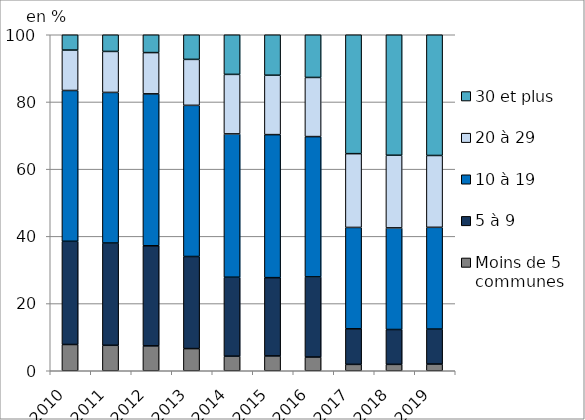
| Category | Moins de 5 communes | 5 à 9 | 10 à 19 | 20 à 29 | 30 et plus |
|---|---|---|---|---|---|
| 2010.0 | 7.813 | 30.716 | 44.887 | 12.026 | 4.558 |
| 2011.0 | 7.58 | 30.435 | 44.825 | 12.197 | 4.963 |
| 2012.0 | 7.4 | 29.795 | 45.215 | 12.282 | 5.308 |
| 2013.0 | 6.596 | 27.402 | 44.992 | 13.681 | 7.329 |
| 2014.0 | 4.336 | 23.497 | 42.657 | 17.716 | 11.795 |
| 2015.0 | 4.407 | 23.301 | 42.569 | 17.675 | 12.049 |
| 2016.0 | 4.074 | 23.86 | 41.756 | 17.604 | 12.706 |
| 2017.0 | 1.896 | 10.585 | 30.174 | 21.959 | 35.387 |
| 2018.0 | 1.9 | 10.372 | 30.245 | 21.615 | 35.867 |
| 2019.0 | 1.987 | 10.413 | 30.286 | 21.383 | 35.93 |